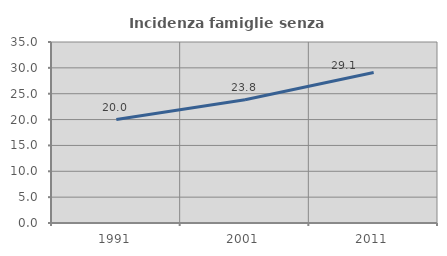
| Category | Incidenza famiglie senza nuclei |
|---|---|
| 1991.0 | 20 |
| 2001.0 | 23.835 |
| 2011.0 | 29.109 |